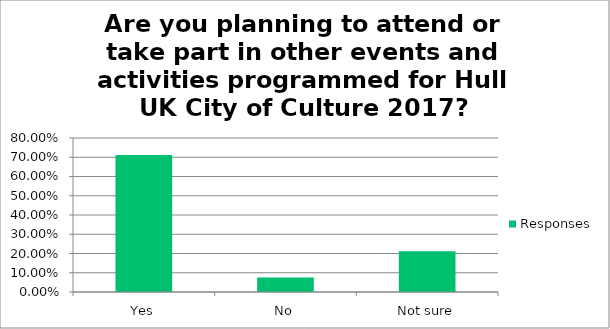
| Category | Responses |
|---|---|
| Yes | 0.712 |
| No | 0.076 |
| Not sure | 0.212 |